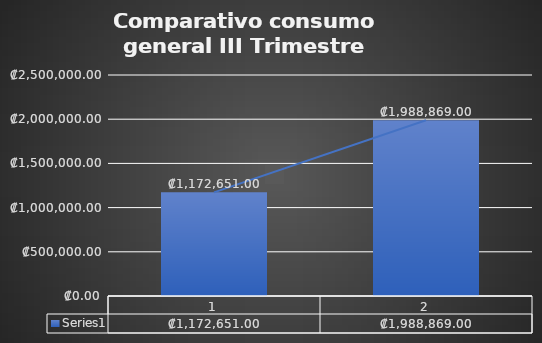
| Category | Series 0 |
|---|---|
| 0 | 1172651 |
| 1 | 1988869 |